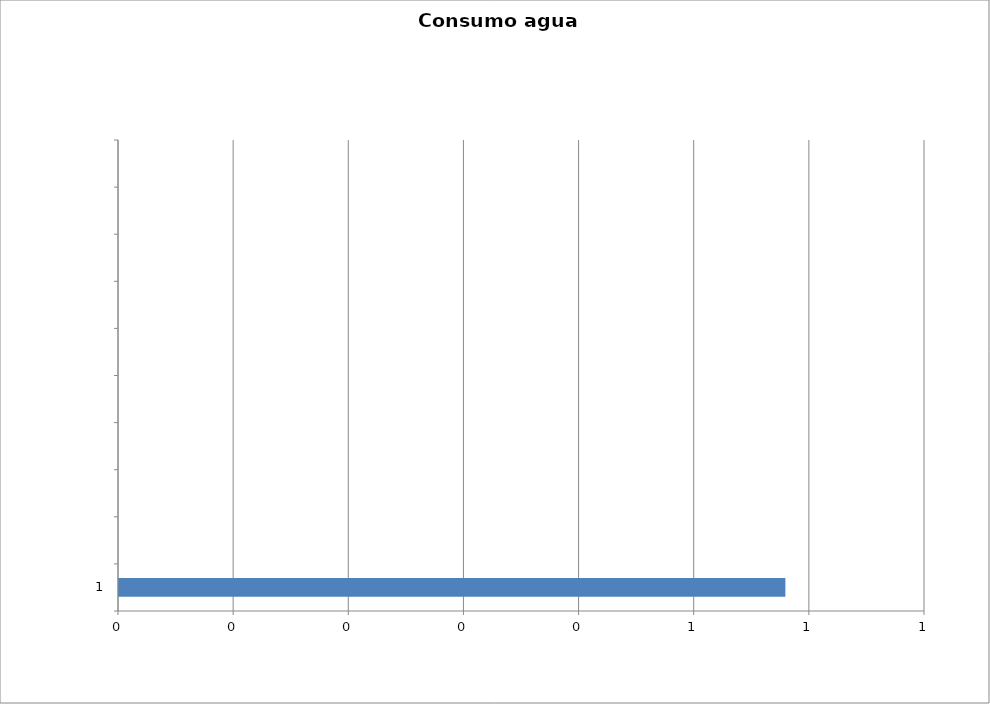
| Category | Series 0 |
|---|---|
| 1 | 0.579 |